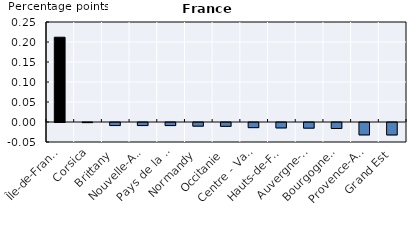
| Category | Series 0 | Series 1 | Series 2 | Series 3 |
|---|---|---|---|---|
| Île-de-France | 0.212 | 0 | 0 | 0 |
| Corsica | 0 | 0 | 0 | 0 |
| Brittany | 0 | 0 | 0 | -0.008 |
| Nouvelle-Aquitaine | 0 | 0 | 0 | -0.008 |
| Pays de la Loire | 0 | 0 | 0 | -0.008 |
| Normandy | 0 | 0 | 0 | -0.009 |
| Occitanie | 0 | 0 | 0 | -0.01 |
| Centre - Val de Loire | 0 | 0 | 0 | -0.013 |
| Hauts-de-France | 0 | 0 | 0 | -0.014 |
| Auvergne-Rhône-Alpes | 0 | 0 | 0 | -0.014 |
| Bourgogne-Franche-Comté | 0 | 0 | 0 | -0.015 |
| Provence-Alpes-Côte d’Azur | 0 | 0 | 0 | -0.031 |
| Grand Est | 0 | 0 | 0 | -0.031 |